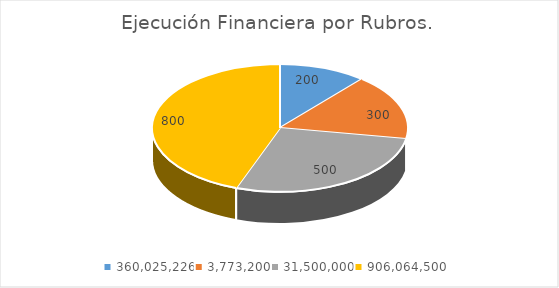
| Category | Series 0 | 360.025.226 |
|---|---|---|
| 360025226.0 | 200 | 360025226 |
| 3773200.0 | 300 | 3773200 |
| 31500000.0 | 500 | 31500000 |
| 906064500.0 | 800 | 906064500 |